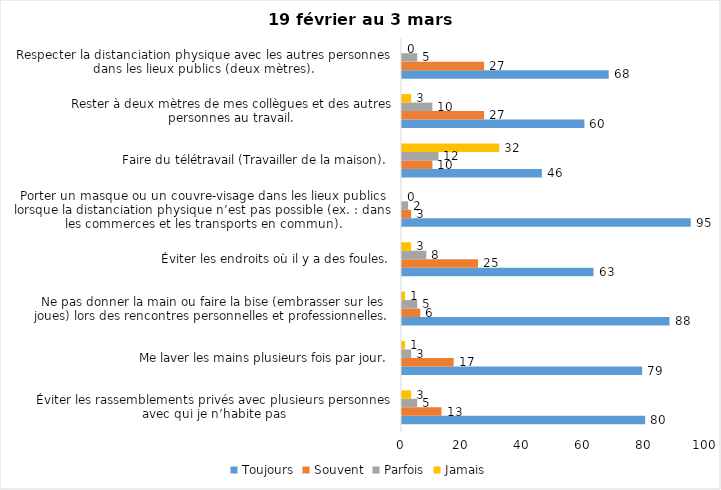
| Category | Toujours | Souvent | Parfois | Jamais |
|---|---|---|---|---|
| Éviter les rassemblements privés avec plusieurs personnes avec qui je n’habite pas | 80 | 13 | 5 | 3 |
| Me laver les mains plusieurs fois par jour. | 79 | 17 | 3 | 1 |
| Ne pas donner la main ou faire la bise (embrasser sur les joues) lors des rencontres personnelles et professionnelles. | 88 | 6 | 5 | 1 |
| Éviter les endroits où il y a des foules. | 63 | 25 | 8 | 3 |
| Porter un masque ou un couvre-visage dans les lieux publics lorsque la distanciation physique n’est pas possible (ex. : dans les commerces et les transports en commun). | 95 | 3 | 2 | 0 |
| Faire du télétravail (Travailler de la maison). | 46 | 10 | 12 | 32 |
| Rester à deux mètres de mes collègues et des autres personnes au travail. | 60 | 27 | 10 | 3 |
| Respecter la distanciation physique avec les autres personnes dans les lieux publics (deux mètres). | 68 | 27 | 5 | 0 |